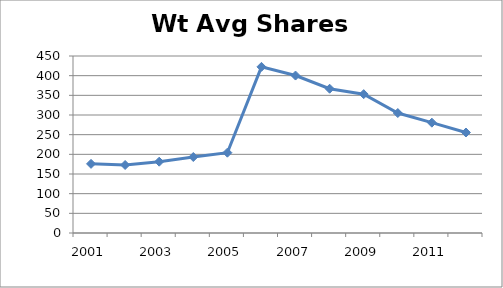
| Category | Wt Avg Shares (dil) |
|---|---|
| 2001.0 | 175.8 |
| 2002.0 | 172.9 |
| 2003.0 | 181.3 |
| 2004.0 | 193.2 |
| 2005.0 | 204.2 |
| 2006.0 | 422.4 |
| 2007.0 | 400.3 |
| 2008.0 | 366.8 |
| 2009.0 | 353 |
| 2010.0 | 305 |
| 2011.0 | 280.5 |
| 2012.0 | 255.5 |